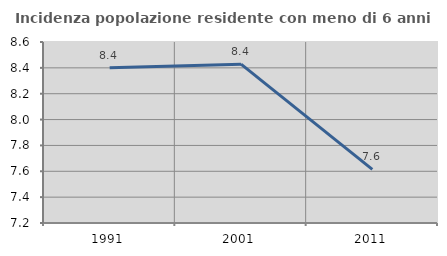
| Category | Incidenza popolazione residente con meno di 6 anni |
|---|---|
| 1991.0 | 8.401 |
| 2001.0 | 8.428 |
| 2011.0 | 7.614 |